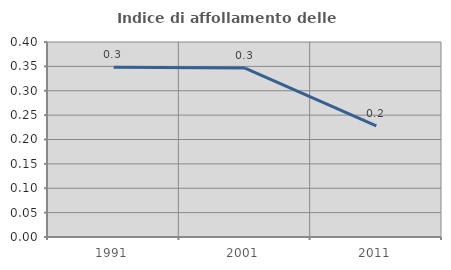
| Category | Indice di affollamento delle abitazioni  |
|---|---|
| 1991.0 | 0.348 |
| 2001.0 | 0.346 |
| 2011.0 | 0.228 |